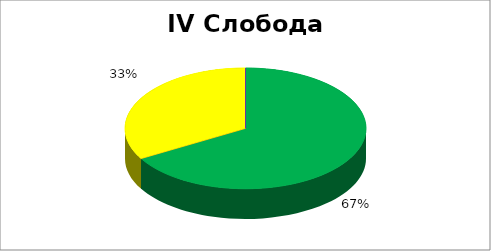
| Category | IV Слобода вероисповести |
|---|---|
| 0 | 0.667 |
| 1 | 0 |
| 2 | 0.333 |
| 3 | 0 |
| 4 | 0 |